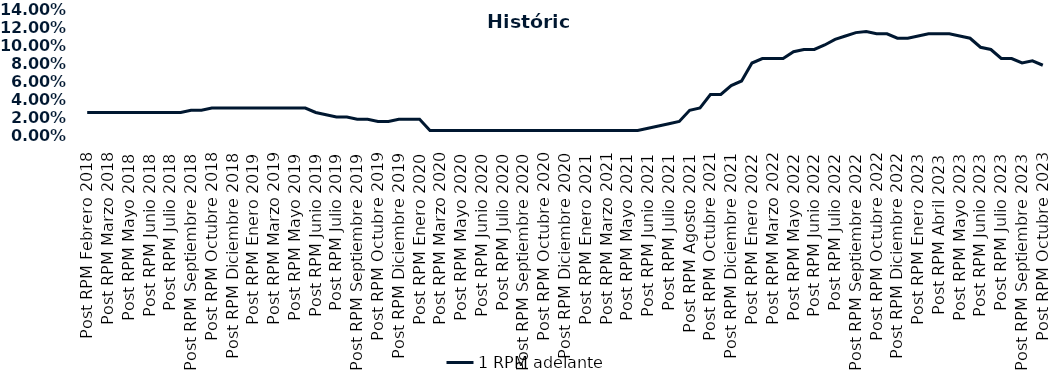
| Category | 1 RPM adelante |
|---|---|
| Post RPM Febrero 2018 | 0.025 |
| Pre RPM Marzo 2018 | 0.025 |
| Post RPM Marzo 2018 | 0.025 |
| Pre RPM Mayo 2018 | 0.025 |
| Post RPM Mayo 2018 | 0.025 |
| Pre RPM Junio 2018 | 0.025 |
| Post RPM Junio 2018 | 0.025 |
| Pre RPM Julio 2018 | 0.025 |
| Post RPM Julio 2018 | 0.025 |
| Pre RPM Septiembre 2018 | 0.025 |
| Post RPM Septiembre 2018 | 0.028 |
| Pre RPM Octubre 2018 | 0.028 |
| Post RPM Octubre 2018 | 0.03 |
| Pre RPM Diciembre 2018 | 0.03 |
| Post RPM Diciembre 2018 | 0.03 |
| Pre RPM Enero 2019 | 0.03 |
| Post RPM Enero 2019 | 0.03 |
| Pre RPM Marzo 2019 | 0.03 |
| Post RPM Marzo 2019 | 0.03 |
| Pre RPM Mayo 2019 | 0.03 |
| Post RPM Mayo 2019 | 0.03 |
| Pre RPM Junio 2019 | 0.03 |
| Post RPM Junio 2019 | 0.025 |
| Pre RPM Julio 2019 | 0.022 |
| Post RPM Julio 2019 | 0.02 |
| Pre RPM Septiembre 2019 | 0.02 |
| Post RPM Septiembre 2019 | 0.018 |
| Pre RPM Octubre 2019 | 0.018 |
| Post RPM Octubre 2019 | 0.015 |
| Pre RPM Diciembre 2019 | 0.015 |
| Post RPM Diciembre 2019 | 0.018 |
| Pre RPM Enero 2020 | 0.018 |
| Post RPM Enero 2020 | 0.018 |
| Pre RPM Marzo 2020 | 0.005 |
| Post RPM Marzo 2020 | 0.005 |
| Pre RPM Mayo 2020 | 0.005 |
| Post RPM Mayo 2020 | 0.005 |
| Pre RPM Junio 2020 | 0.005 |
| Post RPM Junio 2020 | 0.005 |
| Pre RPM Julio 2020 | 0.005 |
| Post RPM Julio 2020 | 0.005 |
| Pre RPM Septiembre 2020 | 0.005 |
| Post RPM Septiembre 2020 | 0.005 |
| Pre RPM Octubre 2020 | 0.005 |
| Post RPM Octubre 2020 | 0.005 |
| Pre RPM Diciembre 2020 | 0.005 |
| Post RPM Diciembre 2020 | 0.005 |
| Pre RPM Enero 2021 | 0.005 |
| Post RPM Enero 2021 | 0.005 |
| Pre RPM Marzo 2021 | 0.005 |
| Post RPM Marzo 2021 | 0.005 |
| Pre RPM Mayo 2021 | 0.005 |
| Post RPM Mayo 2021 | 0.005 |
| Pre RPM Junio 2021 | 0.005 |
| Post RPM Junio 2021 | 0.008 |
| Pre RPM Julio 2021 | 0.01 |
| Post RPM Julio 2021 | 0.012 |
| Pre RPM Agosto 2021 | 0.015 |
| Post RPM Agosto 2021 | 0.028 |
| Pre RPM Octubre 2021 | 0.03 |
| Post RPM Octubre 2021 | 0.045 |
| Pre RPM Diciembre 2021 | 0.045 |
| Post RPM Diciembre 2021 | 0.055 |
| Pre RPM Enero 2022 | 0.06 |
| Post RPM Enero 2022 | 0.08 |
| Pre RPM Marzo 2022 | 0.085 |
| Post RPM Marzo 2022 | 0.085 |
| Pre RPM Mayo 2022 | 0.085 |
| Post RPM Mayo 2022 | 0.092 |
| Pre RPM Junio 2022 | 0.095 |
| Post RPM Junio 2022 | 0.095 |
| Pre RPM Julio 2022 | 0.1 |
| Post RPM Julio 2022 | 0.106 |
| Pre RPM Septiembre 2022 | 0.11 |
| Post RPM Septiembre 2022 | 0.114 |
| Pre RPM Octubre 2022 | 0.115 |
| Post RPM Octubre 2022 | 0.112 |
| Pre RPM Diciembre 2022 | 0.112 |
| Post RPM Diciembre 2022 | 0.108 |
| Pre RPM Enero 2023 | 0.108 |
| Post RPM Enero 2023 | 0.11 |
| Pre RPM Abril 2023 | 0.112 |
| Post RPM Abril 2023 | 0.112 |
| Pre RPM Mayo 2023 | 0.112 |
| Post RPM Mayo 2023 | 0.11 |
| Pre RPM Junio 2023 | 0.108 |
| Post RPM Junio 2023 | 0.098 |
| Pre RPM Julio 2023 | 0.095 |
| Post RPM Julio 2023 | 0.085 |
| Pre RPM Septiembre 2023 | 0.085 |
| Post RPM Septiembre 2023 | 0.08 |
| Pre RPM Octubre 2023 | 0.082 |
| Post RPM Octubre 2023 | 0.078 |